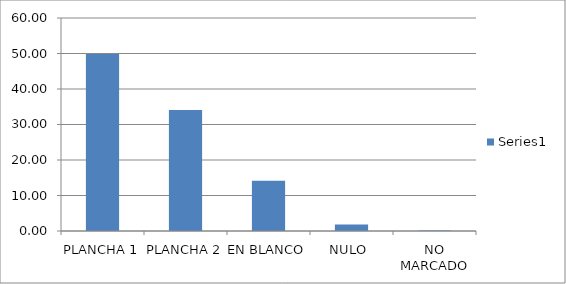
| Category | Series 0 |
|---|---|
| PLANCHA 1 | 49.87 |
| PLANCHA 2 | 34.066 |
| EN BLANCO | 14.126 |
| NULO  | 1.826 |
| NO MARCADO | 0.112 |